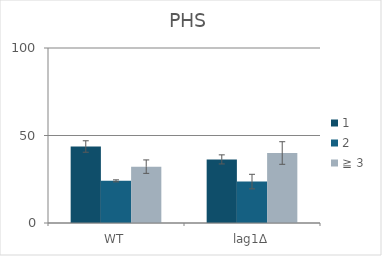
| Category | 1 | 2 | ≧ 3 |
|---|---|---|---|
| WT | 43.707 | 24.09 | 32.203 |
| lag1∆ | 36.338 | 23.667 | 39.995 |